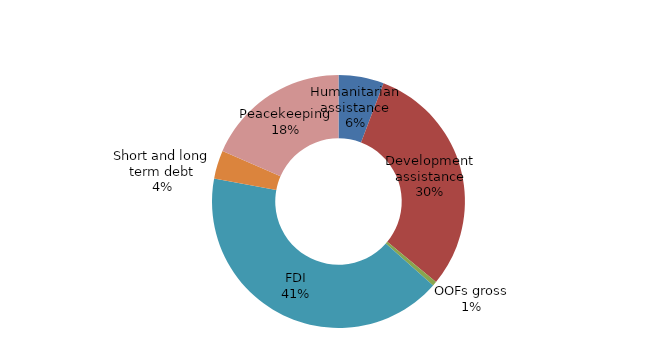
| Category | Series 0 |
|---|---|
| Humanitarian assistance | 0.464 |
| Development assistance | 2.417 |
| OOFs gross | 0.044 |
| Remittances | 0 |
| FDI | 3.312 |
| Short and long term debt | 0.289 |
| Portfolio equity | 0 |
| Peacekeeping | 1.479 |